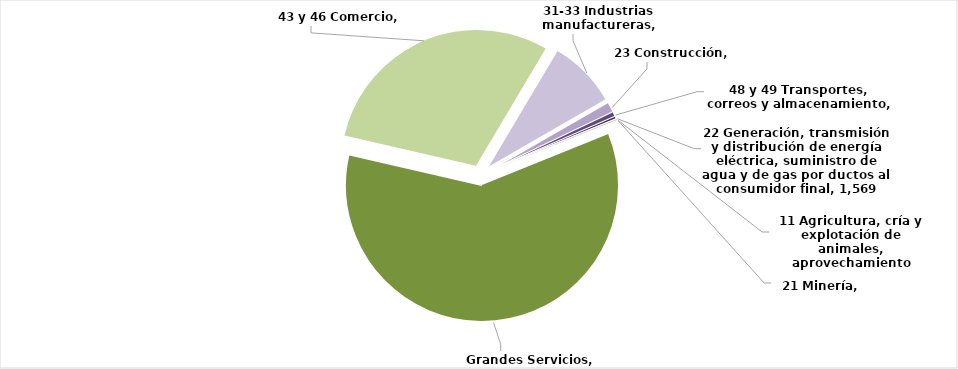
| Category | Series 0 |
|---|---|
| Grandes Servicios | 310928 |
| 43 y 46 Comercio | 155794 |
| 31-33 Industrias manufactureras | 42458 |
| 23 Construcción | 6318 |
| 48 y 49 Transportes, correos y almacenamiento | 2969 |
| 22 Generación, transmisión y distribución de energía eléctrica, suministro de agua y de gas por ductos al consumidor final | 1569 |
| 11 Agricultura, cría y explotación de animales, aprovechamiento forestal, pesca y caza | 291 |
| 21 Minería | 279 |